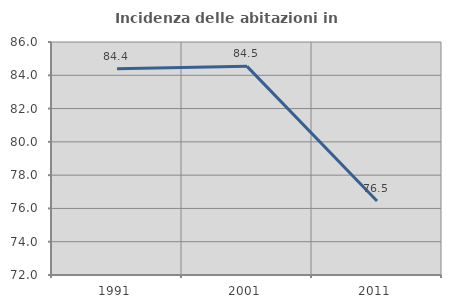
| Category | Incidenza delle abitazioni in proprietà  |
|---|---|
| 1991.0 | 84.399 |
| 2001.0 | 84.536 |
| 2011.0 | 76.451 |